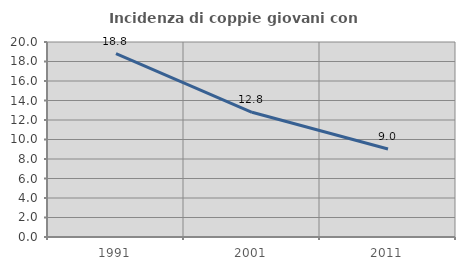
| Category | Incidenza di coppie giovani con figli |
|---|---|
| 1991.0 | 18.818 |
| 2001.0 | 12.792 |
| 2011.0 | 9.024 |